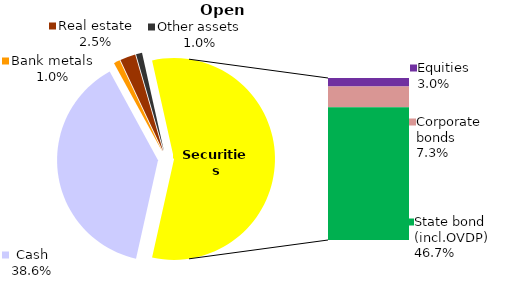
| Category | Open |
|---|---|
| Cash | 382.286 |
| Bank metals | 9.809 |
| Real estate | 24.658 |
| Other assets | 9.677 |
| Equities | 29.603 |
| Corporate bonds | 72.828 |
| Municipal bonds | 0 |
| State bond (incl.OVDP) | 462.677 |